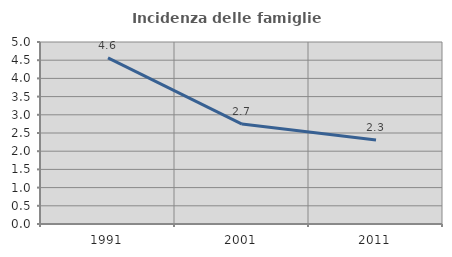
| Category | Incidenza delle famiglie numerose |
|---|---|
| 1991.0 | 4.562 |
| 2001.0 | 2.746 |
| 2011.0 | 2.306 |